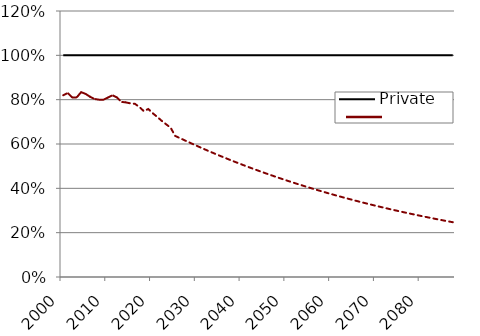
| Category | Private | Medicare |
|---|---|---|
| 2000.0 | 1 | 0.82 |
| 2001.0 | 1 | 0.83 |
| 2002.0 | 1 | 0.81 |
| 2003.0 | 1 | 0.81 |
| 2004.0 | 1 | 0.834 |
| 2005.0 | 1 | 0.826 |
| 2006.0 | 1 | 0.813 |
| 2007.0 | 1 | 0.803 |
| 2008.0 | 1 | 0.8 |
| 2009.0 | 1 | 0.8 |
| 2010.0 | 1 | 0.81 |
| 2011.0 | 1 | 0.82 |
| 2012.0 | 1 | 0.81 |
| 2013.0 | 1 | 0.79 |
| 2014.0 | 1 | 0.788 |
| 2015.0 | 1 | 0.783 |
| 2016.0 | 1 | 0.781 |
| 2017.0 | 1 | 0.767 |
| 2018.0 | 1 | 0.748 |
| 2019.0 | 1 | 0.758 |
| 2020.0 | 1 | 0.739 |
| 2021.0 | 1 | 0.722 |
| 2022.0 | 1 | 0.704 |
| 2023.0 | 1 | 0.689 |
| 2024.0 | 1 | 0.673 |
| 2025.0 | 1 | 0.636 |
| 2026.0 | 1 | 0.627 |
| 2027.0 | 1 | 0.618 |
| 2028.0 | 1 | 0.608 |
| 2029.0 | 1 | 0.599 |
| 2030.0 | 1 | 0.59 |
| 2031.0 | 1 | 0.581 |
| 2032.0 | 1 | 0.572 |
| 2033.0 | 1 | 0.564 |
| 2034.0 | 1 | 0.555 |
| 2035.0 | 1 | 0.547 |
| 2036.0 | 1 | 0.538 |
| 2037.0 | 1 | 0.53 |
| 2038.0 | 1 | 0.522 |
| 2039.0 | 1 | 0.514 |
| 2040.0 | 1 | 0.507 |
| 2041.0 | 1 | 0.499 |
| 2042.0 | 1 | 0.491 |
| 2043.0 | 1 | 0.484 |
| 2044.0 | 1 | 0.477 |
| 2045.0 | 1 | 0.469 |
| 2046.0 | 1 | 0.462 |
| 2047.0 | 1 | 0.455 |
| 2048.0 | 1 | 0.448 |
| 2049.0 | 1 | 0.442 |
| 2050.0 | 1 | 0.435 |
| 2051.0 | 1 | 0.428 |
| 2052.0 | 1 | 0.422 |
| 2053.0 | 1 | 0.415 |
| 2054.0 | 1 | 0.409 |
| 2055.0 | 1 | 0.403 |
| 2056.0 | 1 | 0.397 |
| 2057.0 | 1 | 0.391 |
| 2058.0 | 1 | 0.385 |
| 2059.0 | 1 | 0.379 |
| 2060.0 | 1 | 0.373 |
| 2061.0 | 1 | 0.368 |
| 2062.0 | 1 | 0.362 |
| 2063.0 | 1 | 0.357 |
| 2064.0 | 1 | 0.351 |
| 2065.0 | 1 | 0.346 |
| 2066.0 | 1 | 0.341 |
| 2067.0 | 1 | 0.335 |
| 2068.0 | 1 | 0.33 |
| 2069.0 | 1 | 0.325 |
| 2070.0 | 1 | 0.32 |
| 2071.0 | 1 | 0.316 |
| 2072.0 | 1 | 0.311 |
| 2073.0 | 1 | 0.306 |
| 2074.0 | 1 | 0.301 |
| 2075.0 | 1 | 0.297 |
| 2076.0 | 1 | 0.292 |
| 2077.0 | 1 | 0.288 |
| 2078.0 | 1 | 0.284 |
| 2079.0 | 1 | 0.279 |
| 2080.0 | 1 | 0.275 |
| 2081.0 | 1 | 0.271 |
| 2082.0 | 1 | 0.267 |
| 2083.0 | 1 | 0.263 |
| 2084.0 | 1 | 0.259 |
| 2085.0 | 1 | 0.255 |
| 2086.0 | 1 | 0.251 |
| 2087.0 | 1 | 0.247 |